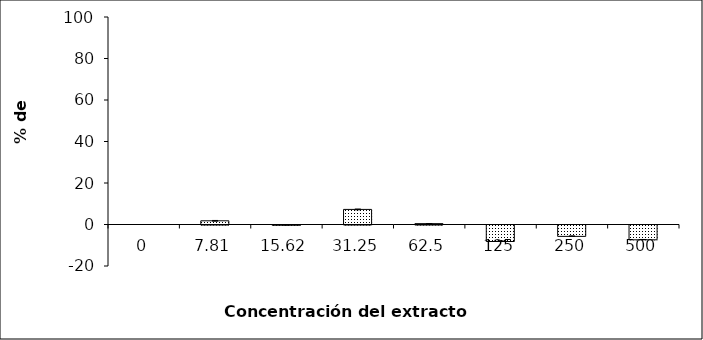
| Category | Series 0 |
|---|---|
| 0.0 | 0 |
| 7.81 | 1.783 |
| 15.62 | -0.137 |
| 31.25 | 7.27 |
| 62.5 | 0.412 |
| 125.0 | -7.956 |
| 250.0 | -5.487 |
| 500.0 | -7.133 |